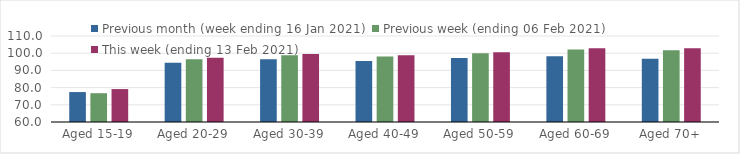
| Category | Previous month (week ending 16 Jan 2021) | Previous week (ending 06 Feb 2021) | This week (ending 13 Feb 2021) |
|---|---|---|---|
| Aged 15-19 | 77.4 | 76.74 | 79.14 |
| Aged 20-29 | 94.39 | 96.49 | 97.36 |
| Aged 30-39 | 96.5 | 98.87 | 99.6 |
| Aged 40-49 | 95.41 | 98.08 | 98.76 |
| Aged 50-59 | 97.2 | 99.91 | 100.59 |
| Aged 60-69 | 98.27 | 102.11 | 102.86 |
| Aged 70+ | 96.77 | 101.69 | 102.88 |